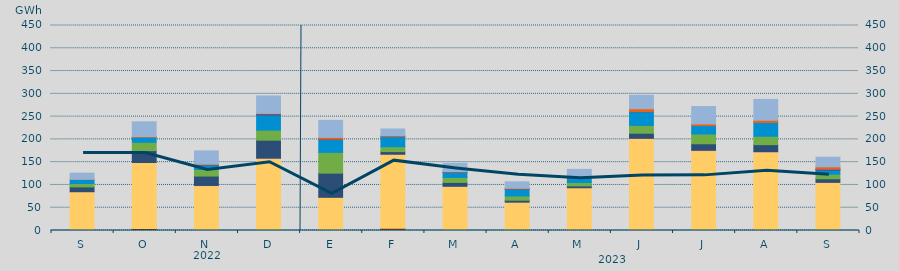
| Category | Carbón | Ciclo Combinado | Cogeneración | Consumo Bombeo | Eólica | Hidráulica | Nuclear | Otras Renovables | Solar fotovoltaica | Solar térmica | Turbinación bombeo |
|---|---|---|---|---|---|---|---|---|---|---|---|
| S | 2236 | 82926.675 | 23 | 10509.975 | 7386.425 | 8900.725 | 0 | 0 | 476.125 | 0 | 13369.775 |
| O | 4283 | 144842.475 | 127.925 | 26134.8 | 18277.325 | 11041.025 | 22.5 | 0 | 1111.175 | 0 | 32778.95 |
| N | 861.375 | 97623.7 | 419.15 | 20591.575 | 14440 | 9978.175 | 722.075 | 1 | 1239.075 | 0 | 28866.575 |
| D | 2372.95 | 155746.55 | 697.65 | 39478.975 | 22031.425 | 33537.4 | 2006.425 | 0 | 1334.875 | 0 | 38128.575 |
| E | 1284.5 | 71547.4 | 0 | 53164.775 | 45462.95 | 28173.35 | 832.7 | 0 | 3920.525 | 0 | 37262.825 |
| F | 5209.75 | 162258.025 | 4.5 | 5734.4 | 10650.1 | 22890.65 | 0 | 26 | 1697.2 | 0 | 14370.575 |
| M | 1206.25 | 95878.75 | 28.525 | 8412.525 | 10950.5 | 11649.375 | 291.075 | 0 | 997.65 | 0 | 18026.625 |
| A | 95 | 62173.25 | 34.425 | 4159.95 | 9407.775 | 15400.95 | 65.5 | 0 | 1513.55 | 0 | 13985.1 |
| M | 53 | 93854.15 | 22.625 | 3893.75 | 7479.975 | 9063.875 | 377.575 | 0 | 1716.575 | 0 | 17696.4 |
| J | 1199.5 | 200824.35 | 314.8 | 11178.5 | 17206.65 | 30102.475 | 201.5 | 0 | 6216.85 | 0 | 29529.225 |
| J | 468.8 | 174954.2 | 648.625 | 14357.5 | 21420.05 | 18314.475 | 0 | 0 | 3759.55 | 0 | 38182.8 |
| A | 2071.15 | 170328.85 | 646.325 | 15367.25 | 18494.75 | 30120.575 | 0 | 0 | 4976.775 | 0 | 45807.425 |
| S | 242.5 | 105492.6 | 2.25 | 7781 | 9960.15 | 9303.9 | 1998.5 | 2 | 5033.1 | 0 | 21057.1 |